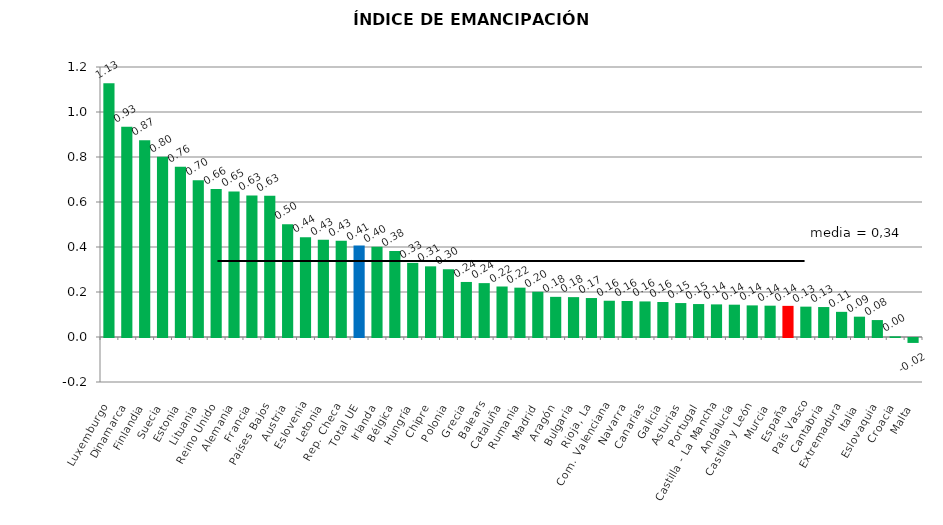
| Category | Series 0 |
|---|---|
| Luxemburgo | 1.128 |
| Dinamarca | 0.934 |
| Finlandia | 0.875 |
| Suecia | 0.801 |
| Estonia | 0.756 |
| Lituania | 0.697 |
| Reino Unido | 0.658 |
| Alemania | 0.647 |
| Francia | 0.629 |
| Países Bajos | 0.628 |
| Austria | 0.501 |
| Eslovenia | 0.443 |
| Letonia | 0.432 |
| Rep. Checa | 0.428 |
| Total UE | 0.407 |
| Irlanda | 0.401 |
| Bélgica | 0.382 |
| Hungría | 0.329 |
| Chipre | 0.314 |
| Polonia | 0.301 |
| Grecia | 0.245 |
| Balears | 0.239 |
| Cataluña | 0.224 |
| Rumania | 0.219 |
| Madrid | 0.201 |
| Aragón | 0.178 |
| Bulgaria | 0.177 |
| Rioja, La | 0.173 |
| Com. Valenciana | 0.161 |
| Navarra | 0.16 |
| Canarias | 0.158 |
| Galicia | 0.156 |
| Asturias | 0.151 |
| Portugal | 0.146 |
| Castilla - La Mancha | 0.145 |
| Andalucía | 0.144 |
| Castilla y León | 0.14 |
| Murcia | 0.139 |
| España | 0.138 |
| País Vasco | 0.135 |
| Cantabria | 0.133 |
| Extremadura | 0.112 |
| Italia | 0.09 |
| Eslovaquia | 0.075 |
| Croacia | 0.003 |
| Malta | -0.022 |